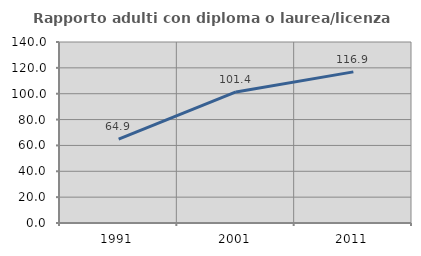
| Category | Rapporto adulti con diploma o laurea/licenza media  |
|---|---|
| 1991.0 | 64.855 |
| 2001.0 | 101.359 |
| 2011.0 | 116.883 |